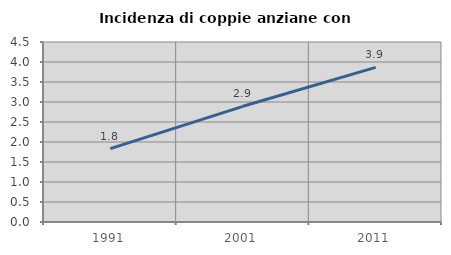
| Category | Incidenza di coppie anziane con figli |
|---|---|
| 1991.0 | 1.833 |
| 2001.0 | 2.892 |
| 2011.0 | 3.864 |